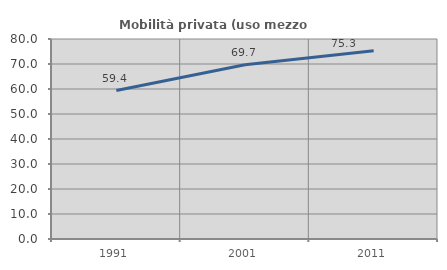
| Category | Mobilità privata (uso mezzo privato) |
|---|---|
| 1991.0 | 59.372 |
| 2001.0 | 69.678 |
| 2011.0 | 75.303 |